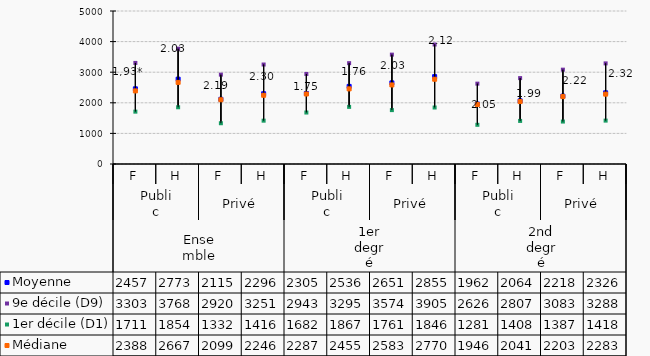
| Category | Moyenne | 9e décile (D9) | 1er décile (D1) | Médiane |
|---|---|---|---|---|
| 0 | 2457 | 3303 | 1711 | 2388 |
| 1 | 2773 | 3768 | 1854 | 2667 |
| 2 | 2115 | 2920 | 1332 | 2099 |
| 3 | 2296 | 3251 | 1416 | 2246 |
| 4 | 2305 | 2943 | 1682 | 2287 |
| 5 | 2536 | 3295 | 1867 | 2455 |
| 6 | 2651 | 3574 | 1761 | 2583 |
| 7 | 2855 | 3905 | 1846 | 2770 |
| 8 | 1962 | 2626 | 1281 | 1946 |
| 9 | 2064 | 2807 | 1408 | 2041 |
| 10 | 2218 | 3083 | 1387 | 2203 |
| 11 | 2326 | 3288 | 1418 | 2283 |